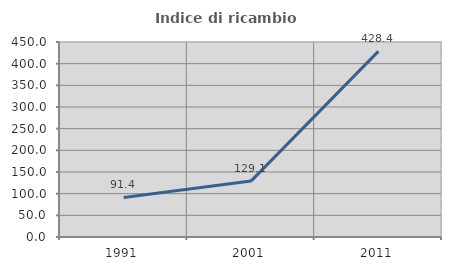
| Category | Indice di ricambio occupazionale  |
|---|---|
| 1991.0 | 91.358 |
| 2001.0 | 129.054 |
| 2011.0 | 428.358 |